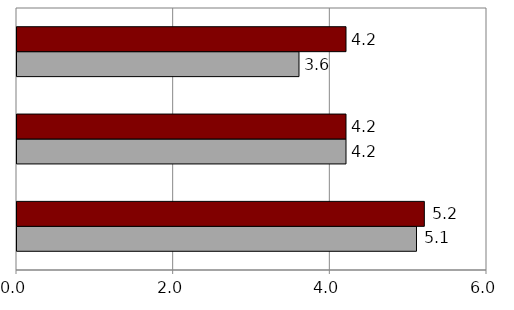
| Category | Series 0 | Series 1 |
|---|---|---|
| Likelihood of working full-time at age 65 (ppt) | 5.1 | 5.2 |
| Likelihood of working full-time at age 62 (ppt) | 4.2 | 4.2 |
| Expected retirement age (months)  | 3.6 | 4.2 |